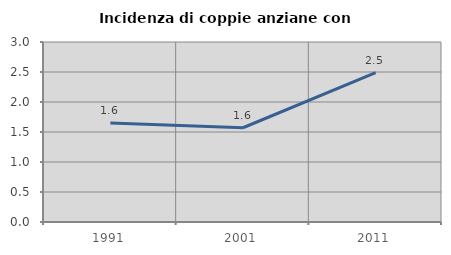
| Category | Incidenza di coppie anziane con figli |
|---|---|
| 1991.0 | 1.648 |
| 2001.0 | 1.571 |
| 2011.0 | 2.489 |